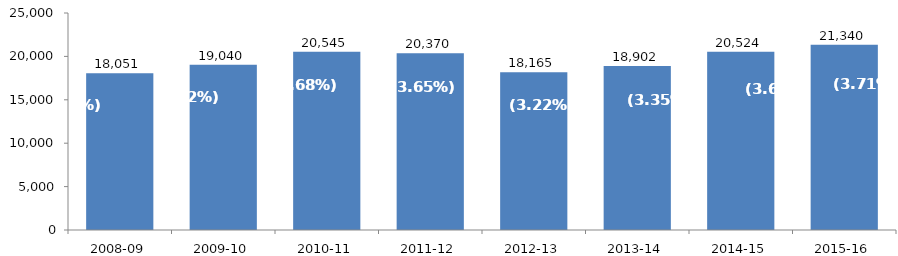
| Category | Homeless Students* |
|---|---|
| 2008-09 | 18051 |
| 2009-10 | 19040 |
| 2010-11 | 20545 |
| 2011-12 | 20370 |
| 2012-13 | 18165 |
| 2013-14 | 18902 |
| 2014-15 | 20524 |
| 2015-16 | 21340 |